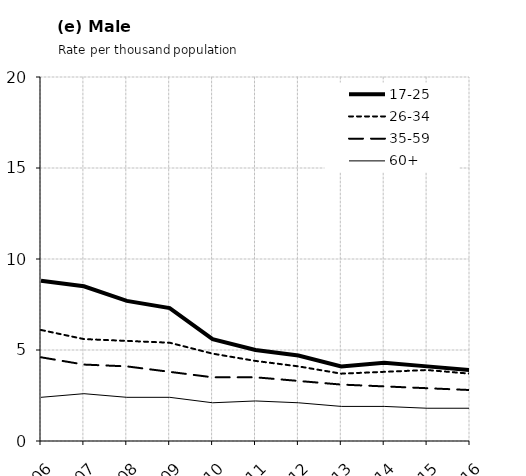
| Category | 17-25 | 26-34 | 35-59 | 60+ |
|---|---|---|---|---|
| 2006.0 | 8.8 | 6.1 | 4.6 | 2.4 |
| 2007.0 | 8.5 | 5.6 | 4.2 | 2.6 |
| 2008.0 | 7.7 | 5.5 | 4.1 | 2.4 |
| 2009.0 | 7.3 | 5.4 | 3.8 | 2.4 |
| 2010.0 | 5.6 | 4.8 | 3.5 | 2.1 |
| 2011.0 | 5 | 4.4 | 3.5 | 2.2 |
| 2012.0 | 4.7 | 4.1 | 3.3 | 2.1 |
| 2013.0 | 4.1 | 3.7 | 3.1 | 1.9 |
| 2014.0 | 4.3 | 3.8 | 3 | 1.9 |
| 2015.0 | 4.1 | 3.9 | 2.9 | 1.8 |
| 2016.0 | 3.9 | 3.7 | 2.8 | 1.8 |